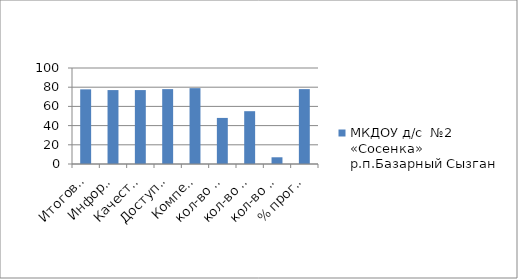
| Category | МКДОУ д/с  №2 «Сосенка» р.п.Базарный Сызган |
|---|---|
| Итоговое значение  (по 4 показателям) | 77.75 |
| Информ. откр. | 77 |
| Качество обр. | 77 |
| Доступность условий | 78 |
| Компетен. педагогов | 79 |
| кол-во проголосовавших | 48 |
| кол-во обучающихся | 55 |
| кол-во непроголосовавших | 7 |
| % проголосовавших | 78 |